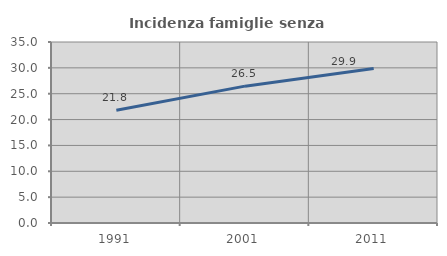
| Category | Incidenza famiglie senza nuclei |
|---|---|
| 1991.0 | 21.795 |
| 2001.0 | 26.464 |
| 2011.0 | 29.867 |